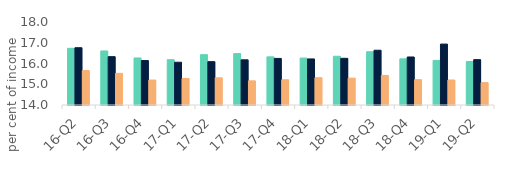
| Category | First-time
buyers | Homemovers | Homowner remortgaging |
|---|---|---|---|
| 16-Q2 | 16.731 | 16.761 | 15.66 |
| 16-Q3 | 16.604 | 16.329 | 15.525 |
| 16-Q4 | 16.267 | 16.143 | 15.203 |
| 17-Q1 | 16.183 | 16.06 | 15.279 |
| 17-Q2 | 16.425 | 16.089 | 15.31 |
| 17-Q3 | 16.477 | 16.177 | 15.163 |
| 17-Q4 | 16.32 | 16.245 | 15.215 |
| 18-Q1 | 16.263 | 16.22 | 15.316 |
| 18-Q2 | 16.349 | 16.25 | 15.296 |
| 18-Q3 | 16.568 | 16.639 | 15.425 |
| 18-Q4 | 16.224 | 16.314 | 15.221 |
| 19-Q1 | 16.149 | 16.936 | 15.205 |
| 19-Q2 | 16.097 | 16.185 | 15.079 |